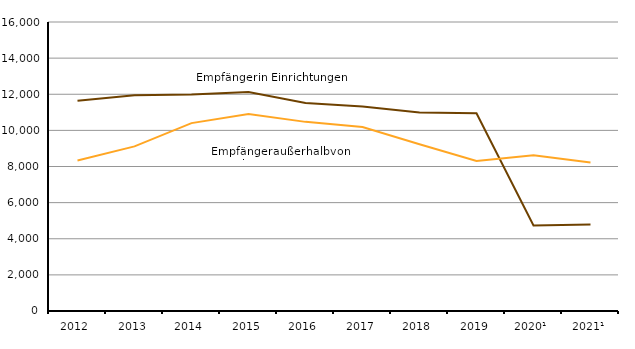
| Category | in Einrichtungen | außerhalb von Einrichtungen |
|---|---|---|
| 2012 | 11644 | 8331 |
| 2013 | 11950 | 9113 |
| 2014 | 11980 | 10401 |
| 2015 | 12129 | 10908 |
| 2016 | 11517 | 10471 |
| 2017 | 11328 | 10182 |
| 2018 | 10990 | 9228 |
| 2019 | 10951 | 8306 |
| 2020¹ | 4730 | 8625 |
| 2021¹ | 4795 | 8225 |